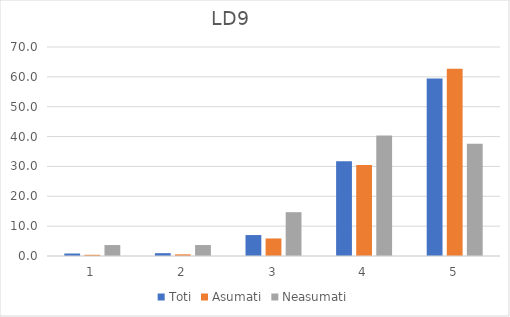
| Category | Toti | Asumati | Neasumati |
|---|---|---|---|
| 0 | 0.832 | 0.41 | 3.67 |
| 1 | 0.951 | 0.546 | 3.67 |
| 2 | 7.015 | 5.874 | 14.679 |
| 3 | 31.748 | 30.464 | 40.367 |
| 4 | 59.453 | 62.705 | 37.615 |